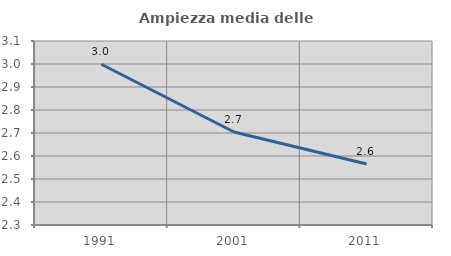
| Category | Ampiezza media delle famiglie |
|---|---|
| 1991.0 | 2.999 |
| 2001.0 | 2.704 |
| 2011.0 | 2.565 |